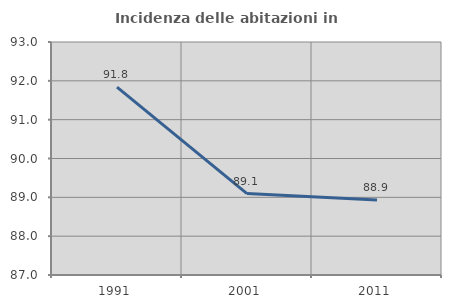
| Category | Incidenza delle abitazioni in proprietà  |
|---|---|
| 1991.0 | 91.837 |
| 2001.0 | 89.098 |
| 2011.0 | 88.931 |